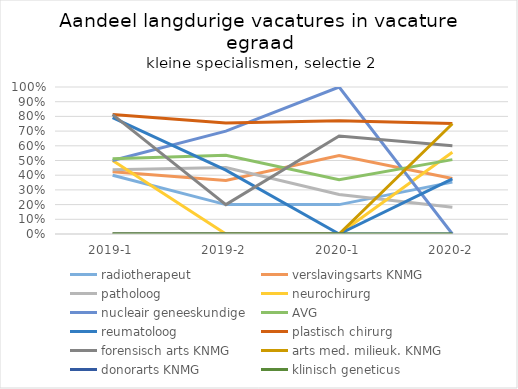
| Category | radiotherapeut | verslavingsarts KNMG | patholoog | neurochirurg | nucleair geneeskundige | AVG | reumatoloog | plastisch chirurg | forensisch arts KNMG | arts med. milieuk. KNMG | donorarts KNMG | klinisch geneticus |
|---|---|---|---|---|---|---|---|---|---|---|---|---|
| 2019-1 | 0.4 | 0.424 | 0.438 | 0.5 | 0.5 | 0.512 | 0.792 | 0.813 | 0.812 | 0 | 0 | 0 |
| 2019-2 | 0.2 | 0.364 | 0.452 | 0 | 0.7 | 0.536 | 0.435 | 0.756 | 0.2 | 0 | 0 | 0 |
| 2020-1 | 0.2 | 0.534 | 0.269 | 0 | 1 | 0.37 | 0 | 0.771 | 0.667 | 0 | 0 | 0 |
| 2020-2 | 0.353 | 0.378 | 0.182 | 0.556 | 0 | 0.506 | 0.375 | 0.752 | 0.6 | 0.75 | 0 | 0 |